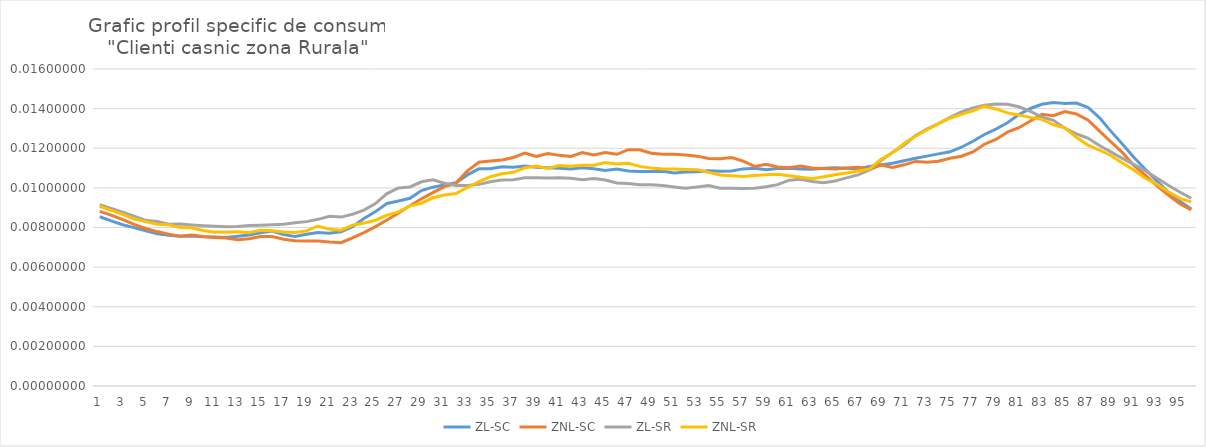
| Category | ZL-SC | ZNL-SC | ZL-SR | ZNL-SR |
|---|---|---|---|---|
| 0 | 0.009 | 0.009 | 0.009 | 0.009 |
| 1 | 0.008 | 0.009 | 0.009 | 0.009 |
| 2 | 0.008 | 0.008 | 0.009 | 0.009 |
| 3 | 0.008 | 0.008 | 0.009 | 0.008 |
| 4 | 0.008 | 0.008 | 0.008 | 0.008 |
| 5 | 0.008 | 0.008 | 0.008 | 0.008 |
| 6 | 0.008 | 0.008 | 0.008 | 0.008 |
| 7 | 0.008 | 0.008 | 0.008 | 0.008 |
| 8 | 0.008 | 0.008 | 0.008 | 0.008 |
| 9 | 0.008 | 0.008 | 0.008 | 0.008 |
| 10 | 0.008 | 0.007 | 0.008 | 0.008 |
| 11 | 0.007 | 0.007 | 0.008 | 0.008 |
| 12 | 0.008 | 0.007 | 0.008 | 0.008 |
| 13 | 0.008 | 0.007 | 0.008 | 0.008 |
| 14 | 0.008 | 0.008 | 0.008 | 0.008 |
| 15 | 0.008 | 0.008 | 0.008 | 0.008 |
| 16 | 0.008 | 0.007 | 0.008 | 0.008 |
| 17 | 0.008 | 0.007 | 0.008 | 0.008 |
| 18 | 0.008 | 0.007 | 0.008 | 0.008 |
| 19 | 0.008 | 0.007 | 0.008 | 0.008 |
| 20 | 0.008 | 0.007 | 0.009 | 0.008 |
| 21 | 0.008 | 0.007 | 0.009 | 0.008 |
| 22 | 0.008 | 0.007 | 0.009 | 0.008 |
| 23 | 0.008 | 0.008 | 0.009 | 0.008 |
| 24 | 0.009 | 0.008 | 0.009 | 0.008 |
| 25 | 0.009 | 0.008 | 0.01 | 0.009 |
| 26 | 0.009 | 0.009 | 0.01 | 0.009 |
| 27 | 0.009 | 0.009 | 0.01 | 0.009 |
| 28 | 0.01 | 0.009 | 0.01 | 0.009 |
| 29 | 0.01 | 0.01 | 0.01 | 0.009 |
| 30 | 0.01 | 0.01 | 0.01 | 0.01 |
| 31 | 0.01 | 0.01 | 0.01 | 0.01 |
| 32 | 0.011 | 0.011 | 0.01 | 0.01 |
| 33 | 0.011 | 0.011 | 0.01 | 0.01 |
| 34 | 0.011 | 0.011 | 0.01 | 0.011 |
| 35 | 0.011 | 0.011 | 0.01 | 0.011 |
| 36 | 0.011 | 0.012 | 0.01 | 0.011 |
| 37 | 0.011 | 0.012 | 0.011 | 0.011 |
| 38 | 0.011 | 0.012 | 0.011 | 0.011 |
| 39 | 0.011 | 0.012 | 0.01 | 0.011 |
| 40 | 0.011 | 0.012 | 0.011 | 0.011 |
| 41 | 0.011 | 0.012 | 0.01 | 0.011 |
| 42 | 0.011 | 0.012 | 0.01 | 0.011 |
| 43 | 0.011 | 0.012 | 0.01 | 0.011 |
| 44 | 0.011 | 0.012 | 0.01 | 0.011 |
| 45 | 0.011 | 0.012 | 0.01 | 0.011 |
| 46 | 0.011 | 0.012 | 0.01 | 0.011 |
| 47 | 0.011 | 0.012 | 0.01 | 0.011 |
| 48 | 0.011 | 0.012 | 0.01 | 0.011 |
| 49 | 0.011 | 0.012 | 0.01 | 0.011 |
| 50 | 0.011 | 0.012 | 0.01 | 0.011 |
| 51 | 0.011 | 0.012 | 0.01 | 0.011 |
| 52 | 0.011 | 0.012 | 0.01 | 0.011 |
| 53 | 0.011 | 0.011 | 0.01 | 0.011 |
| 54 | 0.011 | 0.011 | 0.01 | 0.011 |
| 55 | 0.011 | 0.012 | 0.01 | 0.011 |
| 56 | 0.011 | 0.011 | 0.01 | 0.011 |
| 57 | 0.011 | 0.011 | 0.01 | 0.011 |
| 58 | 0.011 | 0.011 | 0.01 | 0.011 |
| 59 | 0.011 | 0.011 | 0.01 | 0.011 |
| 60 | 0.011 | 0.011 | 0.01 | 0.011 |
| 61 | 0.011 | 0.011 | 0.01 | 0.011 |
| 62 | 0.011 | 0.011 | 0.01 | 0.01 |
| 63 | 0.011 | 0.011 | 0.01 | 0.011 |
| 64 | 0.011 | 0.011 | 0.01 | 0.011 |
| 65 | 0.011 | 0.011 | 0.011 | 0.011 |
| 66 | 0.011 | 0.011 | 0.011 | 0.011 |
| 67 | 0.011 | 0.011 | 0.011 | 0.011 |
| 68 | 0.011 | 0.011 | 0.011 | 0.011 |
| 69 | 0.011 | 0.011 | 0.012 | 0.012 |
| 70 | 0.011 | 0.011 | 0.012 | 0.012 |
| 71 | 0.011 | 0.011 | 0.013 | 0.013 |
| 72 | 0.012 | 0.011 | 0.013 | 0.013 |
| 73 | 0.012 | 0.011 | 0.013 | 0.013 |
| 74 | 0.012 | 0.011 | 0.014 | 0.014 |
| 75 | 0.012 | 0.012 | 0.014 | 0.014 |
| 76 | 0.012 | 0.012 | 0.014 | 0.014 |
| 77 | 0.013 | 0.012 | 0.014 | 0.014 |
| 78 | 0.013 | 0.012 | 0.014 | 0.014 |
| 79 | 0.013 | 0.013 | 0.014 | 0.014 |
| 80 | 0.014 | 0.013 | 0.014 | 0.014 |
| 81 | 0.014 | 0.013 | 0.014 | 0.014 |
| 82 | 0.014 | 0.014 | 0.014 | 0.013 |
| 83 | 0.014 | 0.014 | 0.013 | 0.013 |
| 84 | 0.014 | 0.014 | 0.013 | 0.013 |
| 85 | 0.014 | 0.014 | 0.013 | 0.013 |
| 86 | 0.014 | 0.013 | 0.013 | 0.012 |
| 87 | 0.014 | 0.013 | 0.012 | 0.012 |
| 88 | 0.013 | 0.012 | 0.012 | 0.012 |
| 89 | 0.012 | 0.012 | 0.011 | 0.011 |
| 90 | 0.012 | 0.011 | 0.011 | 0.011 |
| 91 | 0.011 | 0.011 | 0.011 | 0.01 |
| 92 | 0.01 | 0.01 | 0.011 | 0.01 |
| 93 | 0.01 | 0.01 | 0.01 | 0.01 |
| 94 | 0.009 | 0.009 | 0.01 | 0.009 |
| 95 | 0.009 | 0.009 | 0.009 | 0.009 |